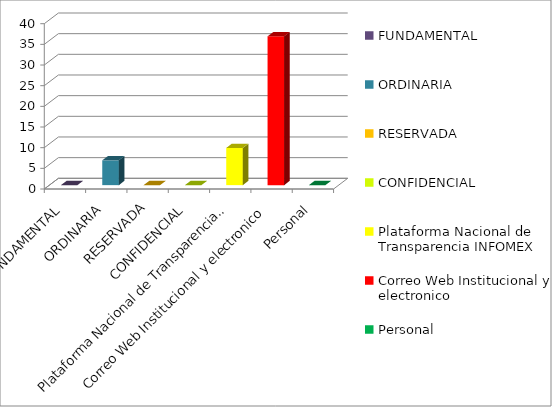
| Category | Series 2 |
|---|---|
| FUNDAMENTAL | 0 |
| ORDINARIA | 6 |
| RESERVADA | 0 |
| CONFIDENCIAL | 0 |
| Plataforma Nacional de Transparencia INFOMEX | 9 |
| Correo Web Institucional y electronico | 36 |
| Personal | 0 |